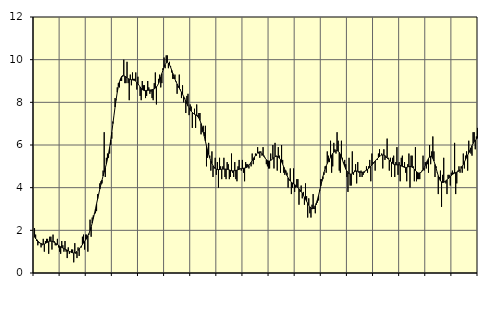
| Category | Piggar | Series 1 |
|---|---|---|
| nan | 2.1 | 1.69 |
| 87.0 | 1.8 | 1.61 |
| 87.0 | 1.5 | 1.57 |
| 87.0 | 1.3 | 1.5 |
| 87.0 | 1.4 | 1.45 |
| 87.0 | 1.4 | 1.4 |
| 87.0 | 1.2 | 1.38 |
| 87.0 | 1.3 | 1.36 |
| 87.0 | 1.6 | 1.35 |
| 87.0 | 1 | 1.36 |
| 87.0 | 1.5 | 1.39 |
| 87.0 | 1.6 | 1.42 |
| nan | 1.6 | 1.44 |
| 88.0 | 0.9 | 1.47 |
| 88.0 | 1.7 | 1.49 |
| 88.0 | 1.7 | 1.49 |
| 88.0 | 1.1 | 1.49 |
| 88.0 | 1.8 | 1.47 |
| 88.0 | 1.5 | 1.44 |
| 88.0 | 1.3 | 1.41 |
| 88.0 | 1.3 | 1.37 |
| 88.0 | 1.6 | 1.34 |
| 88.0 | 1.2 | 1.3 |
| 88.0 | 1 | 1.26 |
| nan | 0.9 | 1.23 |
| 89.0 | 1.5 | 1.2 |
| 89.0 | 1.3 | 1.17 |
| 89.0 | 1 | 1.14 |
| 89.0 | 1.5 | 1.12 |
| 89.0 | 1 | 1.09 |
| 89.0 | 0.7 | 1.07 |
| 89.0 | 1.2 | 1.04 |
| 89.0 | 0.9 | 1.01 |
| 89.0 | 1 | 0.99 |
| 89.0 | 1.1 | 0.96 |
| 89.0 | 1.1 | 0.95 |
| nan | 0.5 | 0.94 |
| 90.0 | 1.4 | 0.95 |
| 90.0 | 0.9 | 0.97 |
| 90.0 | 0.7 | 1.01 |
| 90.0 | 1.2 | 1.06 |
| 90.0 | 0.8 | 1.12 |
| 90.0 | 1.2 | 1.19 |
| 90.0 | 1.2 | 1.26 |
| 90.0 | 1.7 | 1.33 |
| 90.0 | 1.8 | 1.41 |
| 90.0 | 1.1 | 1.48 |
| 90.0 | 1.8 | 1.56 |
| nan | 1.8 | 1.64 |
| 91.0 | 1 | 1.74 |
| 91.0 | 1.8 | 1.85 |
| 91.0 | 2.5 | 1.99 |
| 91.0 | 1.7 | 2.15 |
| 91.0 | 2.6 | 2.34 |
| 91.0 | 2.7 | 2.55 |
| 91.0 | 2.8 | 2.77 |
| 91.0 | 2.8 | 3.01 |
| 91.0 | 2.9 | 3.25 |
| 91.0 | 3.7 | 3.48 |
| 91.0 | 3.7 | 3.71 |
| nan | 4.2 | 3.94 |
| 92.0 | 4.3 | 4.15 |
| 92.0 | 4.2 | 4.36 |
| 92.0 | 4.8 | 4.55 |
| 92.0 | 6.6 | 4.73 |
| 92.0 | 4.5 | 4.92 |
| 92.0 | 5.4 | 5.11 |
| 92.0 | 5.6 | 5.33 |
| 92.0 | 5.4 | 5.59 |
| 92.0 | 5.6 | 5.89 |
| 92.0 | 6 | 6.23 |
| 92.0 | 6.3 | 6.6 |
| nan | 7.1 | 7 |
| 93.0 | 7.4 | 7.4 |
| 93.0 | 8.2 | 7.78 |
| 93.0 | 8.1 | 8.14 |
| 93.0 | 8.7 | 8.47 |
| 93.0 | 8.9 | 8.74 |
| 93.0 | 8.7 | 8.96 |
| 93.0 | 9 | 9.11 |
| 93.0 | 9 | 9.21 |
| 93.0 | 9.2 | 9.25 |
| 93.0 | 10 | 9.25 |
| 93.0 | 8.9 | 9.23 |
| nan | 8.9 | 9.19 |
| 94.0 | 9.9 | 9.15 |
| 94.0 | 8.9 | 9.11 |
| 94.0 | 8.1 | 9.09 |
| 94.0 | 9.3 | 9.07 |
| 94.0 | 8.8 | 9.06 |
| 94.0 | 9.4 | 9.05 |
| 94.0 | 9.1 | 9.04 |
| 94.0 | 9.1 | 9.03 |
| 94.0 | 9.4 | 8.99 |
| 94.0 | 8.6 | 8.94 |
| 94.0 | 9.2 | 8.87 |
| nan | 8.8 | 8.8 |
| 95.0 | 8.3 | 8.72 |
| 95.0 | 8.1 | 8.65 |
| 95.0 | 9 | 8.6 |
| 95.0 | 8.8 | 8.57 |
| 95.0 | 8.8 | 8.55 |
| 95.0 | 8.2 | 8.55 |
| 95.0 | 8.3 | 8.56 |
| 95.0 | 9 | 8.56 |
| 95.0 | 8.7 | 8.57 |
| 95.0 | 8.4 | 8.58 |
| 95.0 | 8.5 | 8.58 |
| nan | 8.2 | 8.59 |
| 96.0 | 8.1 | 8.61 |
| 96.0 | 8.9 | 8.63 |
| 96.0 | 9.4 | 8.67 |
| 96.0 | 7.9 | 8.72 |
| 96.0 | 8.8 | 8.79 |
| 96.0 | 9.1 | 8.89 |
| 96.0 | 9.3 | 9.03 |
| 96.0 | 8.7 | 9.18 |
| 96.0 | 8.9 | 9.35 |
| 96.0 | 9.6 | 9.51 |
| 96.0 | 10.1 | 9.66 |
| nan | 9.6 | 9.77 |
| 97.0 | 10.2 | 9.85 |
| 97.0 | 10.2 | 9.88 |
| 97.0 | 9.6 | 9.84 |
| 97.0 | 9.9 | 9.76 |
| 97.0 | 9.7 | 9.65 |
| 97.0 | 9.4 | 9.51 |
| 97.0 | 9.1 | 9.36 |
| 97.0 | 9.1 | 9.21 |
| 97.0 | 9.3 | 9.09 |
| 97.0 | 9 | 8.97 |
| 97.0 | 8.4 | 8.86 |
| nan | 8.7 | 8.76 |
| 98.0 | 9.3 | 8.67 |
| 98.0 | 8.6 | 8.57 |
| 98.0 | 8.2 | 8.47 |
| 98.0 | 8.8 | 8.38 |
| 98.0 | 8 | 8.27 |
| 98.0 | 8.2 | 8.17 |
| 98.0 | 7.5 | 8.06 |
| 98.0 | 8.3 | 7.94 |
| 98.0 | 8.4 | 7.83 |
| 98.0 | 7.4 | 7.73 |
| 98.0 | 7.9 | 7.65 |
| nan | 7.8 | 7.58 |
| 99.0 | 6.8 | 7.53 |
| 99.0 | 7.5 | 7.48 |
| 99.0 | 7.7 | 7.44 |
| 99.0 | 6.8 | 7.41 |
| 99.0 | 7.9 | 7.38 |
| 99.0 | 7.4 | 7.33 |
| 99.0 | 7.5 | 7.26 |
| 99.0 | 7.5 | 7.15 |
| 99.0 | 6.5 | 7.01 |
| 99.0 | 6.6 | 6.83 |
| 99.0 | 6.9 | 6.63 |
| nan | 6.6 | 6.41 |
| 0.0 | 6.9 | 6.18 |
| 0.0 | 5 | 5.96 |
| 0.0 | 5.4 | 5.75 |
| 0.0 | 6.1 | 5.56 |
| 0.0 | 5.5 | 5.4 |
| 0.0 | 4.8 | 5.25 |
| 0.0 | 5.7 | 5.13 |
| 0.0 | 4.5 | 5.03 |
| 0.0 | 4.9 | 4.95 |
| 0.0 | 5.4 | 4.91 |
| 0.0 | 4.6 | 4.87 |
| nan | 5.2 | 4.85 |
| 1.0 | 4 | 4.85 |
| 1.0 | 5.4 | 4.85 |
| 1.0 | 5 | 4.86 |
| 1.0 | 4.4 | 4.86 |
| 1.0 | 5 | 4.87 |
| 1.0 | 5.4 | 4.87 |
| 1.0 | 4.5 | 4.87 |
| 1.0 | 4.4 | 4.87 |
| 1.0 | 5.2 | 4.86 |
| 1.0 | 5.1 | 4.85 |
| 1.0 | 4.4 | 4.83 |
| nan | 4.5 | 4.81 |
| 2.0 | 5.6 | 4.79 |
| 2.0 | 4.7 | 4.79 |
| 2.0 | 4.5 | 4.79 |
| 2.0 | 5.2 | 4.8 |
| 2.0 | 4.4 | 4.81 |
| 2.0 | 4.3 | 4.82 |
| 2.0 | 5 | 4.84 |
| 2.0 | 5.3 | 4.86 |
| 2.0 | 4.9 | 4.88 |
| 2.0 | 4.8 | 4.89 |
| 2.0 | 5.3 | 4.9 |
| nan | 4.7 | 4.91 |
| 3.0 | 4.3 | 4.92 |
| 3.0 | 5.2 | 4.93 |
| 3.0 | 5.1 | 4.95 |
| 3.0 | 5.1 | 4.99 |
| 3.0 | 4.9 | 5.04 |
| 3.0 | 5.1 | 5.11 |
| 3.0 | 5 | 5.19 |
| 3.0 | 5.6 | 5.27 |
| 3.0 | 5.1 | 5.35 |
| 3.0 | 5.3 | 5.43 |
| 3.0 | 5.6 | 5.51 |
| nan | 5.5 | 5.58 |
| 4.0 | 5.9 | 5.63 |
| 4.0 | 5.6 | 5.67 |
| 4.0 | 5.4 | 5.68 |
| 4.0 | 5.7 | 5.65 |
| 4.0 | 5.5 | 5.6 |
| 4.0 | 5.9 | 5.53 |
| 4.0 | 5.5 | 5.45 |
| 4.0 | 5.4 | 5.38 |
| 4.0 | 5.1 | 5.31 |
| 4.0 | 5 | 5.27 |
| 4.0 | 4.9 | 5.25 |
| nan | 4.9 | 5.25 |
| 5.0 | 5.6 | 5.28 |
| 5.0 | 5.3 | 5.31 |
| 5.0 | 6 | 5.36 |
| 5.0 | 4.9 | 5.41 |
| 5.0 | 6.1 | 5.45 |
| 5.0 | 5.5 | 5.47 |
| 5.0 | 4.8 | 5.47 |
| 5.0 | 5.9 | 5.44 |
| 5.0 | 5.5 | 5.38 |
| 5.0 | 4.7 | 5.31 |
| 5.0 | 6 | 5.21 |
| nan | 5.3 | 5.1 |
| 6.0 | 4.7 | 4.97 |
| 6.0 | 4.6 | 4.84 |
| 6.0 | 4.8 | 4.7 |
| 6.0 | 4.7 | 4.57 |
| 6.0 | 4 | 4.46 |
| 6.0 | 4.4 | 4.37 |
| 6.0 | 4.9 | 4.31 |
| 6.0 | 3.7 | 4.26 |
| 6.0 | 4 | 4.22 |
| 6.0 | 4.9 | 4.18 |
| 6.0 | 3.8 | 4.15 |
| nan | 4 | 4.1 |
| 7.0 | 4.4 | 4.05 |
| 7.0 | 4.4 | 4 |
| 7.0 | 3.2 | 3.95 |
| 7.0 | 3.8 | 3.89 |
| 7.0 | 4.1 | 3.82 |
| 7.0 | 3.5 | 3.74 |
| 7.0 | 3.8 | 3.65 |
| 7.0 | 3.2 | 3.55 |
| 7.0 | 4.2 | 3.46 |
| 7.0 | 3.6 | 3.36 |
| 7.0 | 2.6 | 3.27 |
| nan | 3.5 | 3.18 |
| 8.0 | 2.8 | 3.1 |
| 8.0 | 2.6 | 3.04 |
| 8.0 | 3.2 | 3.01 |
| 8.0 | 3.7 | 3.02 |
| 8.0 | 3 | 3.07 |
| 8.0 | 2.8 | 3.16 |
| 8.0 | 3.2 | 3.29 |
| 8.0 | 3.3 | 3.45 |
| 8.0 | 3.4 | 3.64 |
| 8.0 | 3.9 | 3.85 |
| 8.0 | 4.4 | 4.08 |
| nan | 4.4 | 4.3 |
| 9.0 | 4.4 | 4.52 |
| 9.0 | 4.6 | 4.72 |
| 9.0 | 5 | 4.89 |
| 9.0 | 4.7 | 5.02 |
| 9.0 | 5.7 | 5.13 |
| 9.0 | 5.5 | 5.23 |
| 9.0 | 5.2 | 5.33 |
| 9.0 | 6.2 | 5.43 |
| 9.0 | 4.7 | 5.52 |
| 9.0 | 5 | 5.6 |
| 9.0 | 6.1 | 5.66 |
| nan | 5.8 | 5.7 |
| 10.0 | 5.6 | 5.73 |
| 10.0 | 6.6 | 5.74 |
| 10.0 | 6.2 | 5.71 |
| 10.0 | 4.8 | 5.65 |
| 10.0 | 4.7 | 5.56 |
| 10.0 | 6.2 | 5.44 |
| 10.0 | 5.4 | 5.29 |
| 10.0 | 5.2 | 5.14 |
| 10.0 | 5.3 | 5 |
| 10.0 | 5.1 | 4.87 |
| 10.0 | 4.5 | 4.78 |
| nan | 3.8 | 4.71 |
| 11.0 | 5.4 | 4.66 |
| 11.0 | 4.1 | 4.64 |
| 11.0 | 4.1 | 4.64 |
| 11.0 | 5.7 | 4.67 |
| 11.0 | 4.6 | 4.71 |
| 11.0 | 4.8 | 4.74 |
| 11.0 | 5.1 | 4.77 |
| 11.0 | 4.2 | 4.78 |
| 11.0 | 5.2 | 4.77 |
| 11.0 | 4.7 | 4.76 |
| 11.0 | 4.5 | 4.74 |
| nan | 4.8 | 4.72 |
| 12.0 | 4.5 | 4.72 |
| 12.0 | 4.6 | 4.73 |
| 12.0 | 4.7 | 4.75 |
| 12.0 | 4.8 | 4.78 |
| 12.0 | 5 | 4.82 |
| 12.0 | 4.7 | 4.86 |
| 12.0 | 5 | 4.9 |
| 12.0 | 5.3 | 4.95 |
| 12.0 | 4.3 | 5 |
| 12.0 | 5.6 | 5.06 |
| 12.0 | 5.2 | 5.12 |
| nan | 5.2 | 5.18 |
| 13.0 | 4.8 | 5.25 |
| 13.0 | 5.3 | 5.31 |
| 13.0 | 5.3 | 5.36 |
| 13.0 | 5.6 | 5.41 |
| 13.0 | 5.8 | 5.46 |
| 13.0 | 5.5 | 5.5 |
| 13.0 | 5.6 | 5.53 |
| 13.0 | 4.9 | 5.53 |
| 13.0 | 5.8 | 5.53 |
| 13.0 | 5.3 | 5.5 |
| 13.0 | 5.4 | 5.45 |
| nan | 6.3 | 5.4 |
| 14.0 | 5.4 | 5.34 |
| 14.0 | 4.8 | 5.29 |
| 14.0 | 5.4 | 5.24 |
| 14.0 | 4.5 | 5.19 |
| 14.0 | 5.4 | 5.14 |
| 14.0 | 5.5 | 5.1 |
| 14.0 | 4.5 | 5.08 |
| 14.0 | 5.2 | 5.07 |
| 14.0 | 5.9 | 5.07 |
| 14.0 | 4.6 | 5.07 |
| 14.0 | 5.2 | 5.07 |
| nan | 4.3 | 5.05 |
| 15.0 | 5.4 | 5.02 |
| 15.0 | 5.5 | 4.99 |
| 15.0 | 5 | 4.97 |
| 15.0 | 5.2 | 4.95 |
| 15.0 | 4.7 | 4.95 |
| 15.0 | 4.3 | 4.95 |
| 15.0 | 5.1 | 4.97 |
| 15.0 | 5.6 | 4.99 |
| 15.0 | 4 | 5 |
| 15.0 | 5.5 | 4.99 |
| 15.0 | 5.5 | 4.96 |
| nan | 5 | 4.92 |
| 16.0 | 4.3 | 4.87 |
| 16.0 | 5.9 | 4.81 |
| 16.0 | 4.3 | 4.75 |
| 16.0 | 4.4 | 4.71 |
| 16.0 | 4.4 | 4.68 |
| 16.0 | 4.4 | 4.69 |
| 16.0 | 4.7 | 4.72 |
| 16.0 | 4.8 | 4.77 |
| 16.0 | 5.5 | 4.84 |
| 16.0 | 4.8 | 4.93 |
| 16.0 | 5.2 | 5.04 |
| nan | 4.9 | 5.16 |
| 17.0 | 5.1 | 5.27 |
| 17.0 | 4.7 | 5.37 |
| 17.0 | 6 | 5.44 |
| 17.0 | 5.1 | 5.47 |
| 17.0 | 5.7 | 5.45 |
| 17.0 | 6.4 | 5.37 |
| 17.0 | 5.7 | 5.25 |
| 17.0 | 4.5 | 5.09 |
| 17.0 | 5 | 4.91 |
| 17.0 | 4.7 | 4.72 |
| 17.0 | 3.7 | 4.56 |
| nan | 4.5 | 4.42 |
| 18.0 | 4.8 | 4.32 |
| 18.0 | 3.1 | 4.27 |
| 18.0 | 4.6 | 4.24 |
| 18.0 | 5.4 | 4.25 |
| 18.0 | 4.3 | 4.28 |
| 18.0 | 4.2 | 4.32 |
| 18.0 | 3.7 | 4.37 |
| 18.0 | 4.6 | 4.42 |
| 18.0 | 4.6 | 4.47 |
| 18.0 | 4.1 | 4.53 |
| 18.0 | 4.7 | 4.57 |
| nan | 4.8 | 4.62 |
| 19.0 | 4.7 | 4.65 |
| 19.0 | 6.1 | 4.68 |
| 19.0 | 3.7 | 4.71 |
| 19.0 | 4.2 | 4.73 |
| 19.0 | 4.8 | 4.75 |
| 19.0 | 5 | 4.78 |
| 19.0 | 4.7 | 4.84 |
| 19.0 | 5 | 4.91 |
| 19.0 | 4.7 | 5 |
| 19.0 | 5.6 | 5.09 |
| 19.0 | 4.9 | 5.2 |
| nan | 5.5 | 5.31 |
| 20.0 | 5.7 | 5.41 |
| 20.0 | 4.8 | 5.52 |
| 20.0 | 6.2 | 5.63 |
| 20.0 | 5.7 | 5.74 |
| 20.0 | 5.6 | 5.86 |
| 20.0 | 5.5 | 5.97 |
| 20.0 | 6.6 | 6.07 |
| 20.0 | 6.6 | 6.16 |
| 20.0 | 5.8 | 6.23 |
| 20.0 | 6.4 | 6.28 |
| 20.0 | 6.8 | 6.31 |